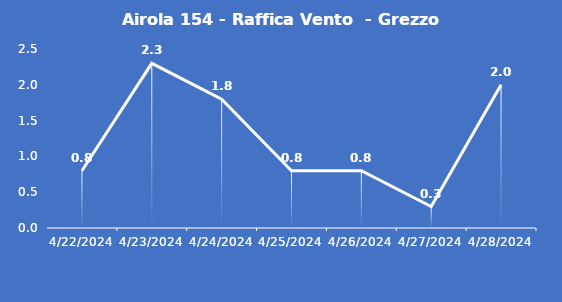
| Category | Airola 154 - Raffica Vento  - Grezzo (m/s) |
|---|---|
| 4/22/24 | 0.8 |
| 4/23/24 | 2.3 |
| 4/24/24 | 1.8 |
| 4/25/24 | 0.8 |
| 4/26/24 | 0.8 |
| 4/27/24 | 0.3 |
| 4/28/24 | 2 |